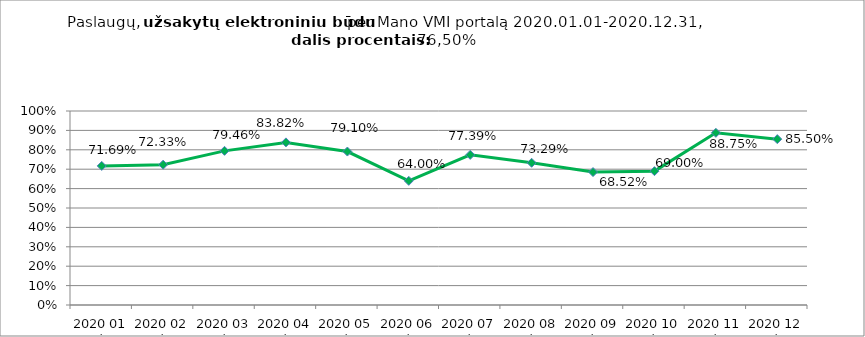
| Category | Elektroniniu būdu užsakytų paslaugų dalis procentais (lyginant su visomis Mano VMI portale užsakytomis paslaugomis) |
|---|---|
| 2020 01 mėn. | 0.717 |
| 2020 02 mėn. | 0.723 |
| 2020 03 mėn. | 0.795 |
| 2020 04 mėn. | 0.838 |
| 2020 05 mėn. | 0.791 |
| 2020 06 mėn. | 0.64 |
| 2020 07 mėn. | 0.774 |
| 2020 08 mėn. | 0.733 |
| 2020 09 mėn. | 0.685 |
| 2020 10 mėn. | 0.69 |
| 2020 11 mėn. | 0.887 |
| 2020 12 mėn. | 0.855 |